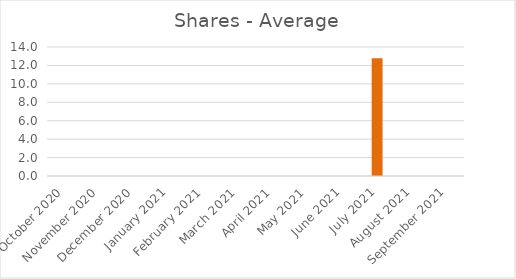
| Category | Average |
|---|---|
| October 2020 | 0 |
| November 2020 | 0 |
| December 2020 | 0 |
| January 2021 | 0 |
| February 2021 | 0 |
| March 2021 | 0 |
| April 2021 | 0 |
| May 2021 | 0 |
| June 2021 | 0 |
| July 2021 | 12.792 |
| August 2021 | 0 |
| September 2021 | 0 |